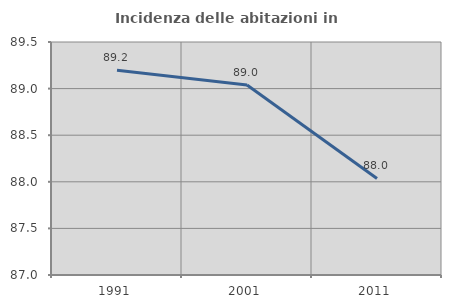
| Category | Incidenza delle abitazioni in proprietà  |
|---|---|
| 1991.0 | 89.196 |
| 2001.0 | 89.038 |
| 2011.0 | 88.035 |